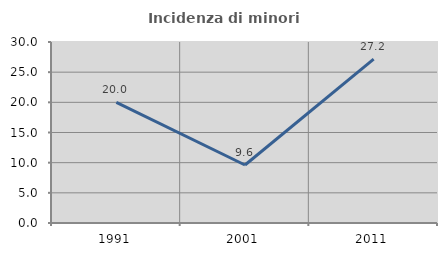
| Category | Incidenza di minori stranieri |
|---|---|
| 1991.0 | 20 |
| 2001.0 | 9.615 |
| 2011.0 | 27.174 |